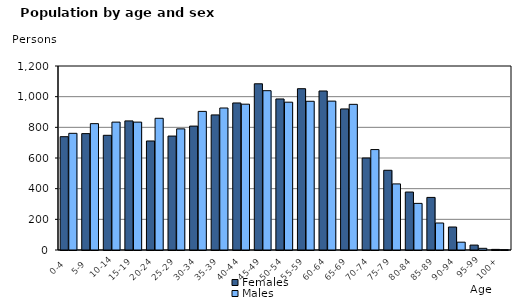
| Category | Females | Males |
|---|---|---|
|   0-4  | 739 | 761 |
|   5-9  | 759 | 824 |
| 10-14 | 748 | 834 |
| 15-19  | 842 | 834 |
| 20-24  | 711 | 859 |
| 25-29  | 743 | 790 |
| 30-34  | 808 | 904 |
| 35-39  | 881 | 926 |
| 40-44  | 959 | 951 |
| 45-49  | 1084 | 1039 |
| 50-54  | 985 | 964 |
| 55-59  | 1052 | 970 |
| 60-64  | 1037 | 971 |
| 65-69  | 920 | 950 |
| 70-74  | 600 | 655 |
| 75-79  | 520 | 431 |
| 80-84  | 378 | 304 |
| 85-89  | 343 | 176 |
| 90-94  | 150 | 51 |
| 95-99 | 32 | 11 |
| 100+ | 4 | 2 |